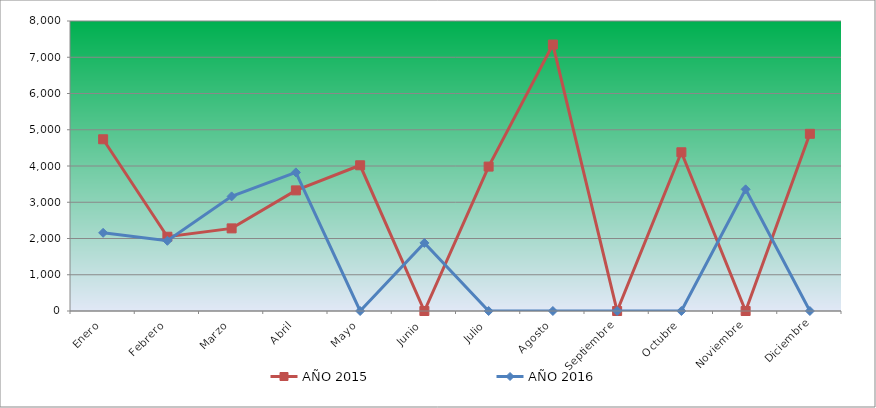
| Category | AÑO 2015 | AÑO 2016 |
|---|---|---|
| Enero | 4737.423 | 2156.473 |
| Febrero | 2048.935 | 1936.188 |
| Marzo | 2279.028 | 3161.64 |
| Abril | 3327.419 | 3823.887 |
| Mayo | 4019.951 | 0 |
| Junio | 0 | 1878.218 |
| Julio | 3983.215 | 0 |
| Agosto | 7349.703 | 0 |
| Septiembre | 0 | 0 |
| Octubre | 4378.687 | 0 |
| Noviembre | 0 | 3356.445 |
| Diciembre | 4888.194 | 0 |